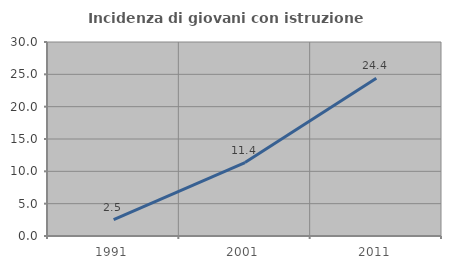
| Category | Incidenza di giovani con istruzione universitaria |
|---|---|
| 1991.0 | 2.525 |
| 2001.0 | 11.364 |
| 2011.0 | 24.409 |